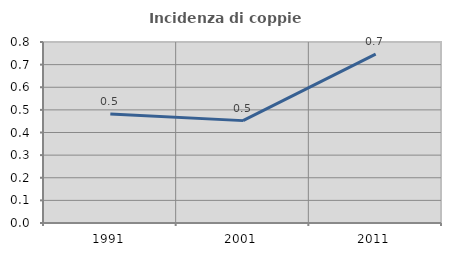
| Category | Incidenza di coppie miste |
|---|---|
| 1991.0 | 0.481 |
| 2001.0 | 0.452 |
| 2011.0 | 0.746 |